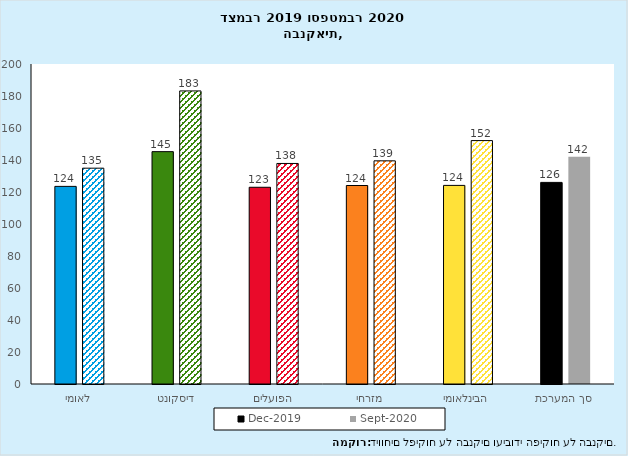
| Category | דצמ-2019 | ספט-2020 |
|---|---|---|
| לאומי | 123.513 | 134.887 |
| דיסקונט | 145.218 | 183.172 |
| הפועלים | 122.956 | 137.835 |
| מזרחי | 124.054 | 139.479 |
| הבינלאומי | 124.124 | 152.13 |
| סך המערכת | 126 | 142 |